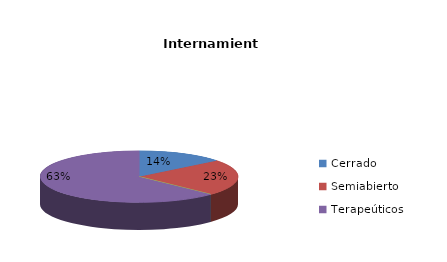
| Category | Series 0 |
|---|---|
| Cerrado | 5 |
| Semiabierto | 8 |
| Abierto | 0 |
| Terapeúticos | 22 |